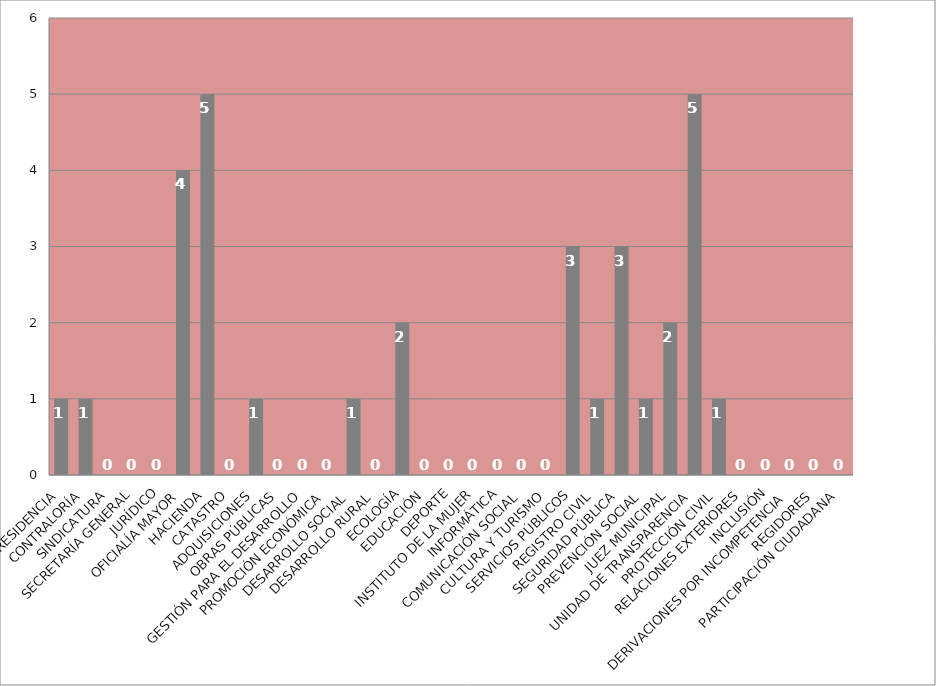
| Category | Series 0 |
|---|---|
| PRESIDENCIA | 1 |
| CONTRALORÍA | 1 |
| SINDICATURA | 0 |
| SECRETARÍA GENERAL | 0 |
| JURÍDICO | 0 |
| OFICIALÍA MAYOR | 4 |
| HACIENDA | 5 |
| CATASTRO | 0 |
| ADQUISICIONES | 1 |
| OBRAS PÚBLICAS | 0 |
| GESTIÓN PARA EL DESARROLLO | 0 |
| PROMOCIÓN ECONÓMICA | 0 |
| DESARROLLO SOCIAL | 1 |
| DESARROLLO RURAL | 0 |
| ECOLOGÍA | 2 |
| EDUCACIÓN | 0 |
| DEPORTE | 0 |
| INSTITUTO DE LA MUJER | 0 |
| INFORMÁTICA | 0 |
| COMUNICACIÓN SOCIAL | 0 |
| CULTURA Y TURISMO | 0 |
| SERVICIOS PÚBLICOS | 3 |
| REGISTRO CIVIL | 1 |
| SEGURIDAD PÚBLICA | 3 |
| PREVENCIÓN SOCIAL | 1 |
| JUEZ MUNICIPAL | 2 |
| UNIDAD DE TRANSPARENCIA | 5 |
| PROTECCIÓN CIVIL | 1 |
| RELACIONES EXTERIORES | 0 |
| INCLUSIÓN | 0 |
| DERIVACIONES POR INCOMPETENCIA | 0 |
| REGIDORES | 0 |
| PARTICIPACIÓN CIUDADANA | 0 |